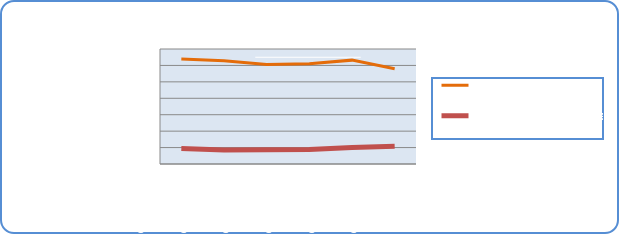
| Category | Motorin Türleri litre | Benzin Türleri litre |
|---|---|---|
| 6/10/19 | 63965307.771 | 9465902.101 |
| 6/11/19 | 62808174.829 | 8593936.58 |
| 6/12/19 | 60541082.889 | 8614727.972 |
| 6/13/19 | 61075443.661 | 8787027.954 |
| 6/14/19 | 63221795.89 | 9999950.334 |
| 6/15/19 | 57978316.584 | 10768098.571 |